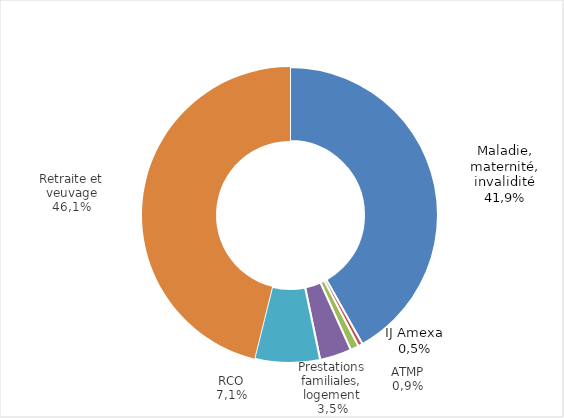
| Category | Series 0 |
|---|---|
| Maladie, maternité, invalidité | 6083.448 |
| IJ Amexa | 69.947 |
| Accidents du travail | 133.933 |
| Prestations familiales, Logement | 503.274 |
| Retraite complémentaire obligatoire (RCO) | 1038.67 |
| Retraite et veuvage | 6702.776 |